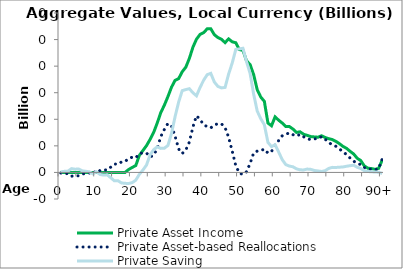
| Category | Private Asset Income | Private Asset-based Reallocations | Private Saving |
|---|---|---|---|
| 0 | 0 | -0.45 | 0.45 |
|  | 0 | -0.808 | 0.808 |
| 2 | 0 | -0.943 | 0.943 |
| 3 | 0 | -2.847 | 2.847 |
| 4 | 0 | -2.451 | 2.451 |
| 5 | 0 | -2.588 | 2.588 |
| 6 | 0 | -1.187 | 1.187 |
| 7 | 0 | -0.859 | 0.859 |
| 8 | 0 | -0.488 | 0.488 |
| 9 | 0 | 1.053 | -1.053 |
| 10 | 0 | -0.489 | 0.489 |
| 11 | 0 | 1.549 | -1.549 |
| 12 | 0 | 2.025 | -2.025 |
| 13 | 0 | 1.79 | -1.79 |
| 14 | 0 | 4.013 | -4.013 |
| 15 | 0 | 6.331 | -6.331 |
| 16 | 0 | 6.22 | -6.22 |
| 17 | 0 | 7.917 | -7.917 |
| 18 | 0 | 8.214 | -8.214 |
| 19 | 2.204 | 10.519 | -8.314 |
| 20 | 3.759 | 11.463 | -7.704 |
| 21 | 5.172 | 11.005 | -5.832 |
| 22 | 12.858 | 14.265 | -1.407 |
| 23 | 16.471 | 14.693 | 1.778 |
| 24 | 20.172 | 14.63 | 5.543 |
| 25 | 24.821 | 11.6 | 13.221 |
| 26 | 30.094 | 13.01 | 17.084 |
| 27 | 37.164 | 17.93 | 19.233 |
| 28 | 45.034 | 26.936 | 18.098 |
| 29 | 50.617 | 32.397 | 18.22 |
| 30 | 57.099 | 36.822 | 20.277 |
| 31 | 64.147 | 34.869 | 29.278 |
| 32 | 69.306 | 27.321 | 41.985 |
| 33 | 70.597 | 17.661 | 52.936 |
| 34 | 75.78 | 14.236 | 61.544 |
| 35 | 79.173 | 16.825 | 62.348 |
| 36 | 85.836 | 22.815 | 63.02 |
| 37 | 94.268 | 34.317 | 59.951 |
| 38 | 100.31 | 42.643 | 57.667 |
| 39 | 103.872 | 39.891 | 63.981 |
| 40 | 105.213 | 35.791 | 69.423 |
| 41 | 108.09 | 34.514 | 73.576 |
| 42 | 108.11 | 33.536 | 74.574 |
| 43 | 103.661 | 35.637 | 68.024 |
| 44 | 101.516 | 36.772 | 64.744 |
| 45 | 100.167 | 36.542 | 63.624 |
| 46 | 97.733 | 33.746 | 63.987 |
| 47 | 100.474 | 26.392 | 74.082 |
| 48 | 98.328 | 15.993 | 82.335 |
| 49 | 97.609 | 5.056 | 92.552 |
| 50 | 92.459 | -0.55 | 93.009 |
| 51 | 91.908 | -1.533 | 93.441 |
| 52 | 83.985 | 0.498 | 83.487 |
| 53 | 81.265 | 6.637 | 74.628 |
| 54 | 73.639 | 14.7 | 58.94 |
| 55 | 62.28 | 16.057 | 46.224 |
| 56 | 56.71 | 16.318 | 40.392 |
| 57 | 53.499 | 17.611 | 35.888 |
| 58 | 37.181 | 14.551 | 22.629 |
| 59 | 35.105 | 15.668 | 19.437 |
| 60 | 41.813 | 20.984 | 20.829 |
| 61 | 39.316 | 23.938 | 15.378 |
| 62 | 37.179 | 27.555 | 9.625 |
| 63 | 34.594 | 28.711 | 5.882 |
| 64 | 34.565 | 29.782 | 4.783 |
| 65 | 32.649 | 28.41 | 4.239 |
| 66 | 30.134 | 27.43 | 2.704 |
| 67 | 30.571 | 28.631 | 1.94 |
| 68 | 28.716 | 26.819 | 1.897 |
| 69 | 27.907 | 25.378 | 2.53 |
| 70 | 26.978 | 24.675 | 2.304 |
| 71 | 26.723 | 25.261 | 1.462 |
| 72 | 26.511 | 25.403 | 1.108 |
| 73 | 27.604 | 26.89 | 0.714 |
| 74 | 26.352 | 25.098 | 1.253 |
| 75 | 25.402 | 22.433 | 2.969 |
| 76 | 24.778 | 20.972 | 3.806 |
| 77 | 23.447 | 19.71 | 3.738 |
| 78 | 21.674 | 17.735 | 3.939 |
| 79 | 19.603 | 15.509 | 4.095 |
| 80 | 18.151 | 13.506 | 4.645 |
| 81 | 15.903 | 10.831 | 5.072 |
| 82 | 13.893 | 8.477 | 5.417 |
| 83 | 10.68 | 6.782 | 3.898 |
| 84 | 8.892 | 5.956 | 2.936 |
| 85 | 4.894 | 3.606 | 1.287 |
| 86 | 3.174 | 2.498 | 0.676 |
| 87 | 2.925 | 2.449 | 0.475 |
| 88 | 2.315 | 1.998 | 0.317 |
| 89 | 3.066 | 2.902 | 0.164 |
| 90+ | 9.334 | 10.073 | -0.739 |